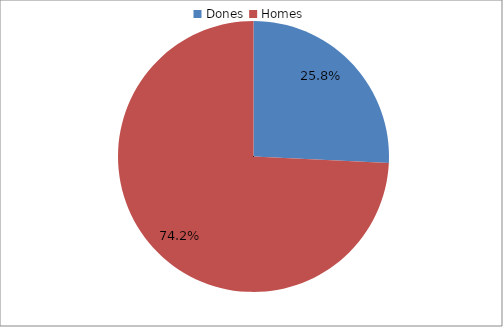
| Category | Series 0 |
|---|---|
| Dones | 0.258 |
| Homes | 0.742 |